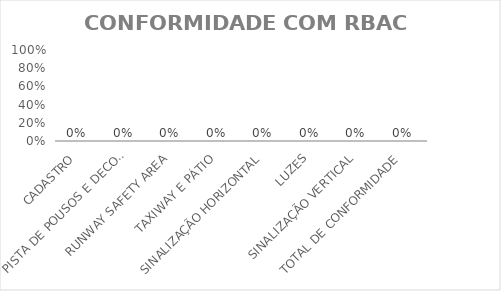
| Category | Series 0 |
|---|---|
| CADASTRO | 0 |
| PISTA DE POUSOS E DECOLAGENS | 0 |
| RUNWAY SAFETY AREA | 0 |
| TAXIWAY E PÁTIO | 0 |
| SINALIZAÇÃO HORIZONTAL | 0 |
| LUZES | 0 |
| SINALIZAÇÃO VERTICAL | 0 |
| TOTAL DE CONFORMIDADE | 0 |